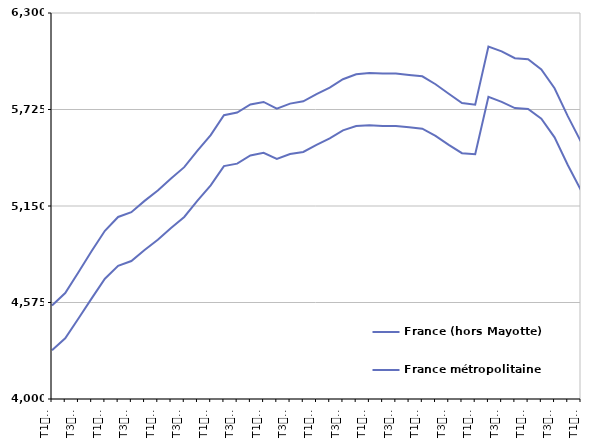
| Category | France (hors Mayotte) | France métropolitaine |
|---|---|---|
| T1
2012 | 4557.2 | 4291 |
| T2
2012 | 4631.5 | 4361.6 |
| T3
2012 | 4755.6 | 4480 |
| T4
2012 | 4881.7 | 4599.7 |
| T1
2013 | 5002.3 | 4716.5 |
| T2
2013 | 5084.8 | 4794 |
| T3
2013 | 5113.2 | 4822.1 |
| T4
2013 | 5180.4 | 4887.5 |
| T1
2014 | 5242.6 | 4949.4 |
| T2
2014 | 5314 | 5018.7 |
| T3
2014 | 5381.5 | 5084.6 |
| T4
2014 | 5479.6 | 5181.7 |
| T1
2015 | 5572.6 | 5273.1 |
| T2
2015 | 5691.3 | 5387.7 |
| T3
2015 | 5706.6 | 5402.5 |
| T4
2015 | 5754.8 | 5451.4 |
| T1
2016 | 5769.9 | 5466.5 |
| T2
2016 | 5730 | 5430.8 |
| T3
2016 | 5760 | 5460.1 |
| T4
2016 | 5773.5 | 5472.1 |
| T1
2017 | 5816.2 | 5513.8 |
| T2
2017 | 5855.6 | 5553.2 |
| T3
2017 | 5905.6 | 5600.8 |
| T4
2017 | 5934.8 | 5626.4 |
| T1
2018 | 5941.8 | 5631.4 |
| T2
2018 | 5939.3 | 5626.8 |
| T3
2018 | 5939.2 | 5626.8 |
| T4
2018 | 5930.7 | 5619 |
| T1
2019 | 5922.7 | 5610.7 |
| T2
2019 | 5875.5 | 5567.6 |
| T3
2019 | 5818.5 | 5514.6 |
| T4
2019 | 5763.1 | 5464.7 |
| T1
2020 | 5753.9 | 5459 |
| T2
2020 | 6100.6 | 5800.5 |
| T3
2020 | 6071.8 | 5770.7 |
| T4
2020 | 6030.4 | 5733.6 |
| T1
2021 | 6024.7 | 5727.8 |
| T2
2021 | 5964.2 | 5669.7 |
| T3
2021 | 5851.5 | 5559.2 |
| T4
2021 | 5685.4 | 5394.2 |
| T1
2022 | 5532.7 | 5244.2 |